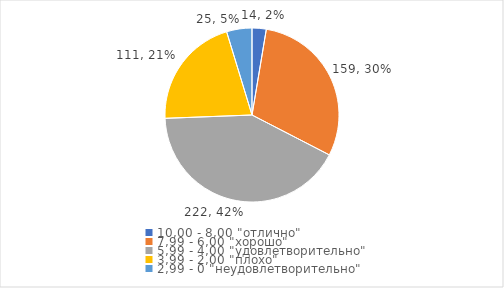
| Category | Series 0 | Series 1 |
|---|---|---|
| 10,00 - 8,00 "отлично" | 14 | 0.026 |
| 7,99 - 6,00 "хорошо" | 159 | 0.299 |
| 5,99 - 4,00 "удовлетворительно" | 222 | 0.418 |
| 3,99 - 2,00 "плохо" | 111 | 0.209 |
| 2,99 - 0 "неудовлетворительно" | 25 | 0.047 |